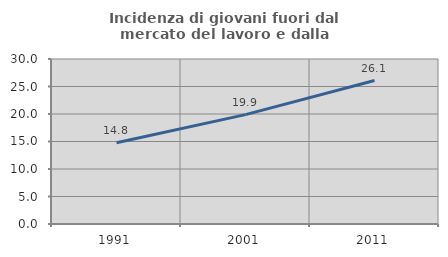
| Category | Incidenza di giovani fuori dal mercato del lavoro e dalla formazione  |
|---|---|
| 1991.0 | 14.783 |
| 2001.0 | 19.886 |
| 2011.0 | 26.087 |